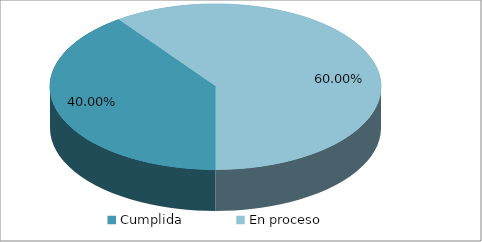
| Category | Series 0 |
|---|---|
| Cumplida | 0.4 |
| En proceso | 0.6 |